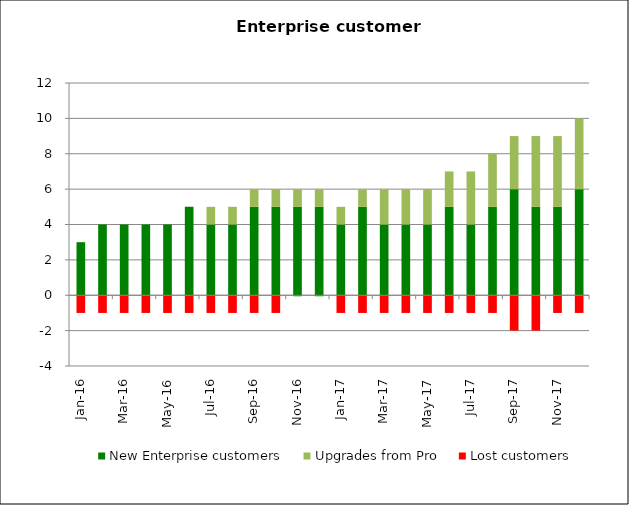
| Category | New Enterprise customers | Upgrades from Pro | Lost customers |
|---|---|---|---|
| 2016-01-01 | 3 | 0 | -1 |
| 2016-02-01 | 4 | 0 | -1 |
| 2016-03-01 | 4 | 0 | -1 |
| 2016-04-01 | 4 | 0 | -1 |
| 2016-05-01 | 4 | 0 | -1 |
| 2016-06-01 | 5 | 0 | -1 |
| 2016-07-01 | 4 | 1 | -1 |
| 2016-08-01 | 4 | 1 | -1 |
| 2016-09-01 | 5 | 1 | -1 |
| 2016-10-01 | 5 | 1 | -1 |
| 2016-11-01 | 5 | 1 | 0 |
| 2016-12-01 | 5 | 1 | 0 |
| 2017-01-01 | 4 | 1 | -1 |
| 2017-02-01 | 5 | 1 | -1 |
| 2017-03-01 | 4 | 2 | -1 |
| 2017-04-01 | 4 | 2 | -1 |
| 2017-05-01 | 4 | 2 | -1 |
| 2017-06-01 | 5 | 2 | -1 |
| 2017-07-01 | 4 | 3 | -1 |
| 2017-08-01 | 5 | 3 | -1 |
| 2017-09-01 | 6 | 3 | -2 |
| 2017-10-01 | 5 | 4 | -2 |
| 2017-11-01 | 5 | 4 | -1 |
| 2017-12-01 | 6 | 4 | -1 |